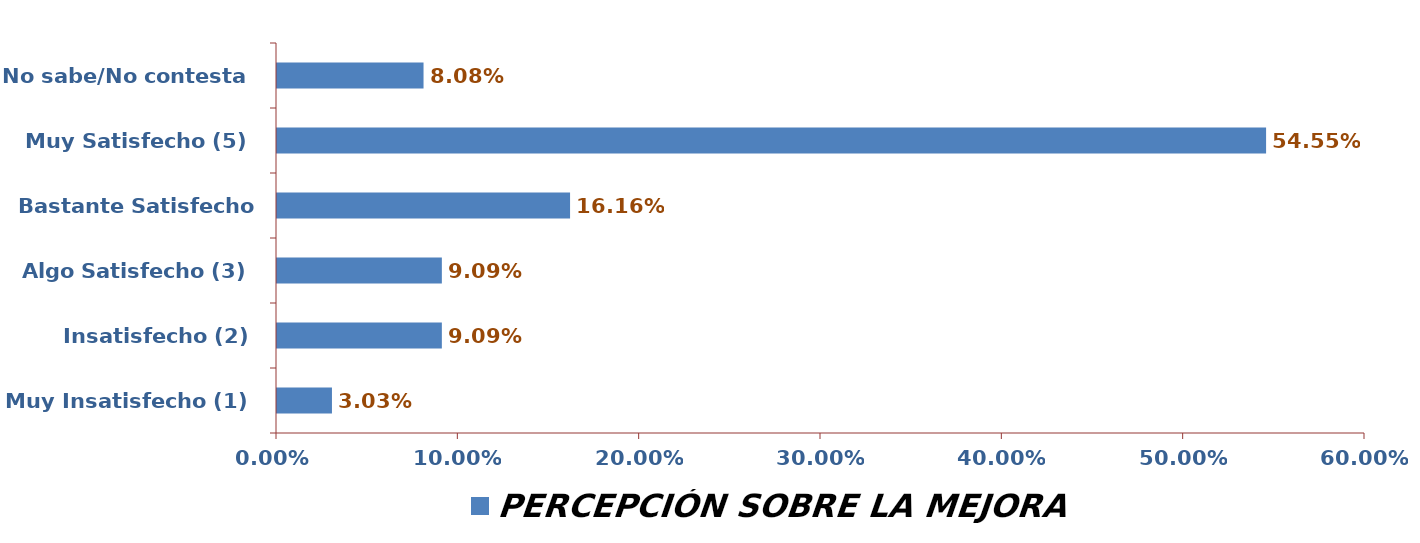
| Category | PERCEPCIÓN SOBRE LA MEJORA |
|---|---|
| Muy Insatisfecho (1) | 0.03 |
| Insatisfecho (2) | 0.091 |
| Algo Satisfecho (3) | 0.091 |
| Bastante Satisfecho (4) | 0.162 |
| Muy Satisfecho (5) | 0.545 |
| No sabe/No contesta | 0.081 |